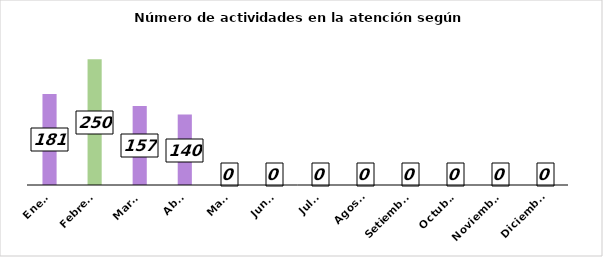
| Category | Series 0 |
|---|---|
| Enero | 181 |
| Febrero | 250 |
| Marzo | 157 |
| Abril | 140 |
| Mayo | 0 |
| Junio | 0 |
| Julio | 0 |
| Agosto | 0 |
| Setiembre | 0 |
| Octubre | 0 |
| Noviembre | 0 |
| Diciembre | 0 |